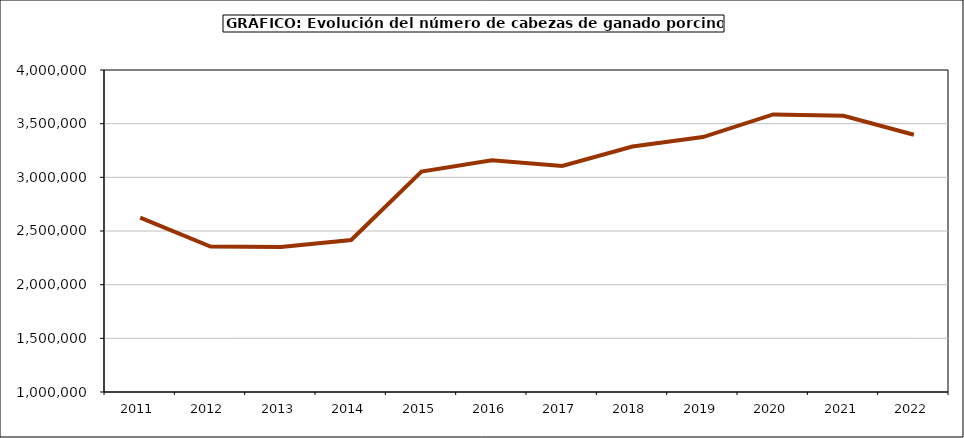
| Category | Total porcino |
|---|---|
| 2011.0 | 2624006 |
| 2012.0 | 2354690 |
| 2013.0 | 2351566 |
| 2014.0 | 2416557.46 |
| 2015.0 | 3053965.076 |
| 2016.0 | 3158719.951 |
| 2017.0 | 3106767.464 |
| 2018.0 | 3287091.287 |
| 2019.0 | 3375280.572 |
| 2020.0 | 3585954 |
| 2021.0 | 3572846 |
| 2022.0 | 3396595 |